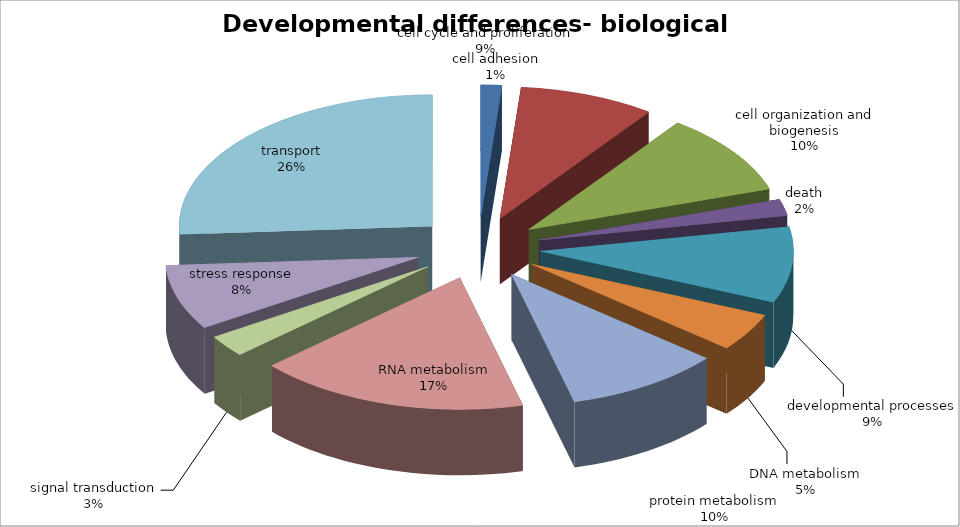
| Category | Series 0 |
|---|---|
| cell adhesion | 2 |
| cell cycle and proliferation | 13 |
| cell organization and biogenesis | 15 |
| death | 3 |
| developmental processes | 14 |
| DNA metabolism | 7 |
| protein metabolism | 15 |
| RNA metabolism | 26 |
| signal transduction | 4 |
| stress response | 12 |
| transport | 39 |